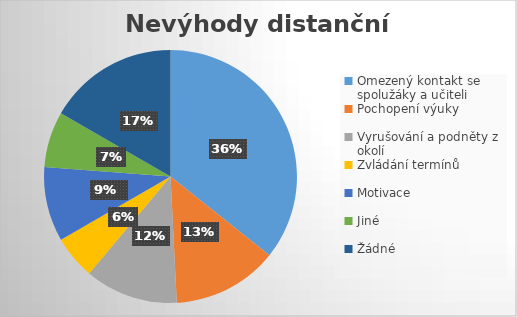
| Category | Series 0 |
|---|---|
| Omezený kontakt se spolužáky a učiteli | 45 |
| Pochopení výuky | 17 |
| Vyrušování a podněty z okolí | 15 |
| Zvládání termínů | 7 |
| Motivace | 12 |
| Jiné | 9 |
| Žádné | 21 |